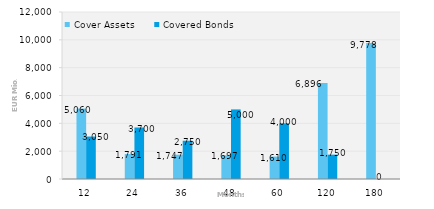
| Category | Cover Assets | Covered Bonds |
|---|---|---|
| 12.0 | 5059.695 | 3050 |
| 24.0 | 1791.321 | 3700 |
| 36.0 | 1746.839 | 2750 |
| 48.0 | 1697.042 | 5000 |
| 60.0 | 1609.626 | 4000 |
| 120.0 | 6895.842 | 1750 |
| 180.0 | 9778.024 | 0 |